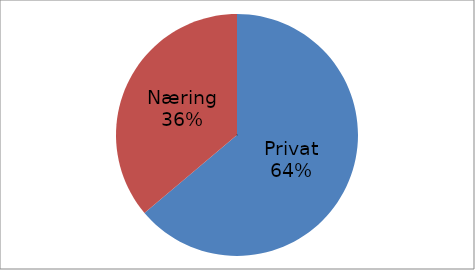
| Category | Series 0 |
|---|---|
| Privat | 41004483 |
| Næring | 23208779 |